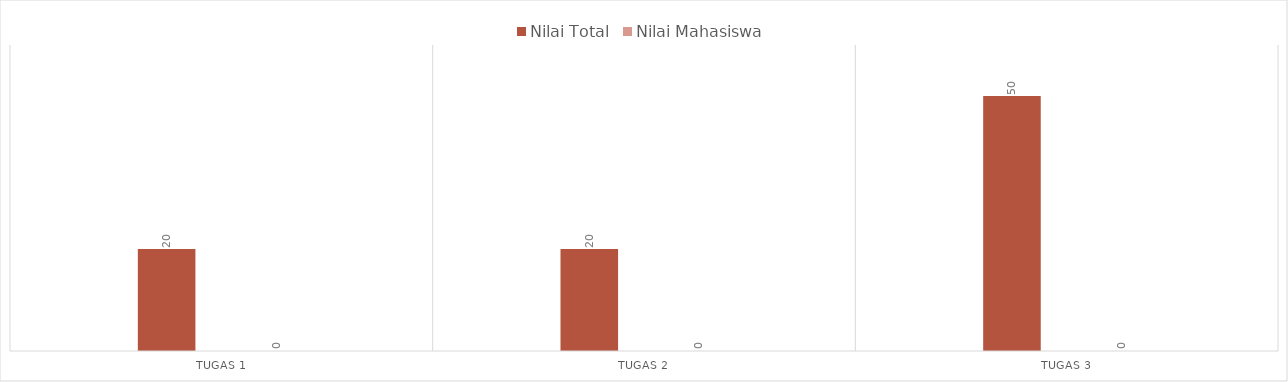
| Category | Nilai Total | Nilai Mahasiswa |
|---|---|---|
| Tugas 1 | 20 | 20 |
| Tugas 2 | 20 | 20 |
| Tugas 3 | 50 | 50 |